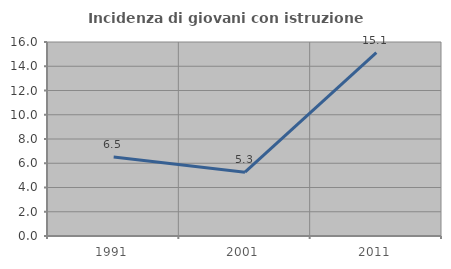
| Category | Incidenza di giovani con istruzione universitaria |
|---|---|
| 1991.0 | 6.522 |
| 2001.0 | 5.263 |
| 2011.0 | 15.116 |